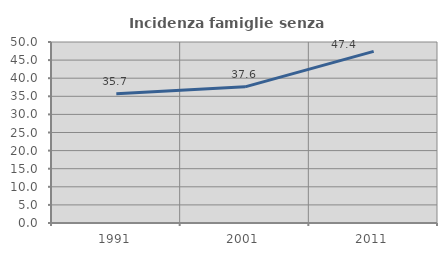
| Category | Incidenza famiglie senza nuclei |
|---|---|
| 1991.0 | 35.714 |
| 2001.0 | 37.615 |
| 2011.0 | 47.414 |